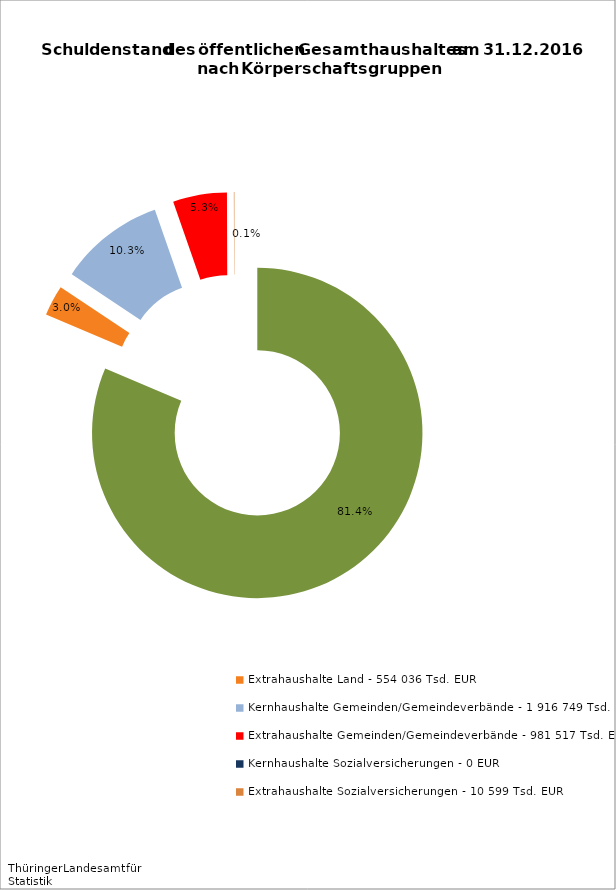
| Category | Series 0 |
|---|---|
| Kernhaushalt Land - 15 133 688 Tsd. EUR | 15133688.048 |
| Extrahaushalte Land - 554 036 Tsd. EUR | 554036.459 |
| Kernhaushalte Gemeinden/Gemeindeverbände - 1 916 749 Tsd. EUR | 1916748.962 |
| Extrahaushalte Gemeinden/Gemeindeverbände - 981 517 Tsd. EUR | 981516.558 |
| Kernhaushalte Sozialversicherungen - 0 EUR | 0 |
| Extrahaushalte Sozialversicherungen - 10 599 Tsd. EUR | 10598.721 |